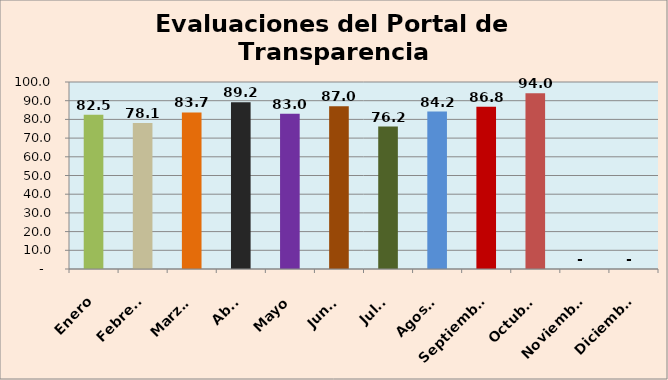
| Category | Evaluaciones  |
|---|---|
| Enero | 82.52 |
| Febrero | 78.1 |
| Marzo  | 83.7 |
| Abril | 89.2 |
| Mayo | 83 |
| Junio | 87 |
| Julio | 76.2 |
| Agosto | 84.2 |
| Septiembre | 86.75 |
| Octubre | 94.04 |
| Noviembre | 0 |
| Diciembre | 0 |